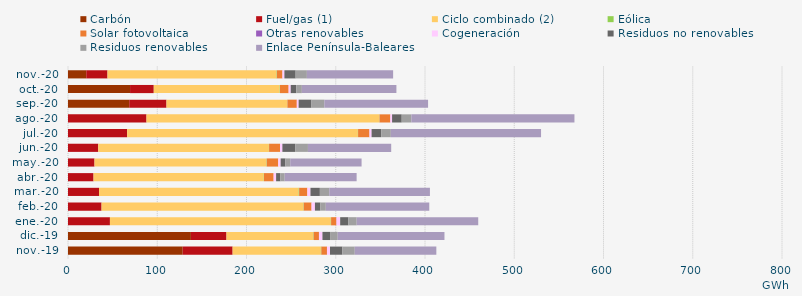
| Category | Carbón | Fuel/gas (1) | Ciclo combinado (2) | Eólica | Solar fotovoltaica | Otras renovables | Cogeneración | Residuos no renovables | Residuos renovables | Enlace Península-Baleares |
|---|---|---|---|---|---|---|---|---|---|---|
| nov.-19 | 128.514 | 55.933 | 98.892 | 0.495 | 6.297 | 0.093 | 3.33 | 13.875 | 13.875 | 91.397 |
| dic.-19 | 137.717 | 39.851 | 97.226 | 0.445 | 5.906 | 0.181 | 3.776 | 8.548 | 8.548 | 119.614 |
| ene.-20 | -3.177 | 46.988 | 247.428 | 0.371 | 5.931 | 0.201 | 4.038 | 9.262 | 9.262 | 136.156 |
| feb.-20 | -1.357 | 37.598 | 226.174 | 0.339 | 8.736 | 0.082 | 3.745 | 6.096 | 6.096 | 115.928 |
| mar.-20 | -1.702 | 34.745 | 223.688 | 0.533 | 9.203 | 0.027 | 3.476 | 10.532 | 10.532 | 112.78 |
| abr.-20 | -1.681 | 28.608 | 190.732 | 0.243 | 10.819 | 0.015 | 2.76 | 4.815 | 4.815 | 80.581 |
| may.-20 | -1.801 | 29.693 | 192.661 | 0.353 | 12.877 | 0.002 | 2.681 | 5.366 | 5.366 | 79.947 |
| jun.-20 | -1.281 | 33.873 | 191.226 | 0.218 | 12.233 | 0.06 | 2.597 | 14.316 | 14.316 | 93.29 |
| jul.-20 | -1.12 | 66.276 | 258.526 | 0.221 | 12.747 | 0.053 | 2.332 | 10.772 | 10.772 | 168.332 |
| ago.-20 | -1.127 | 87.96 | 260.888 | 0.207 | 12.085 | 0.051 | 1.922 | 10.811 | 10.811 | 182.716 |
| sep.-20 | 68.615 | 41.727 | 135.309 | 0.19 | 10.526 | 0.003 | 2.048 | 14.376 | 14.376 | 116.275 |
| oct.-20 | 69.532 | 26.56 | 141.136 | 0.328 | 9.629 | 0.027 | 2.333 | 6.238 | 6.238 | 105.944 |
| nov.-20 | 20.457 | 23.806 | 189.344 | 0.409 | 6.268 | 0.028 | 2.162 | 12.596 | 12.596 | 96.627 |